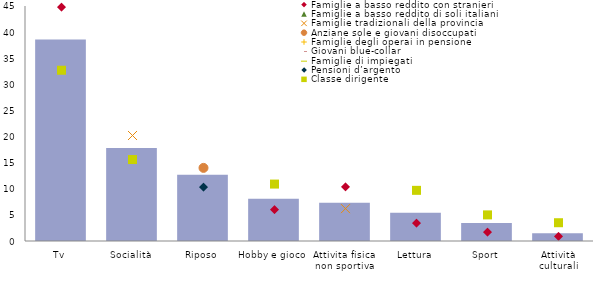
| Category | Totale |
|---|---|
| Tv | 38.6 |
| Socialità | 17.8 |
| Riposo | 12.7 |
| Hobby e gioco | 8.1 |
| Attivita fisica 
non sportiva | 7.308 |
| Lettura | 5.4 |
| Sport | 3.462 |
| Attività culturali | 1.5 |